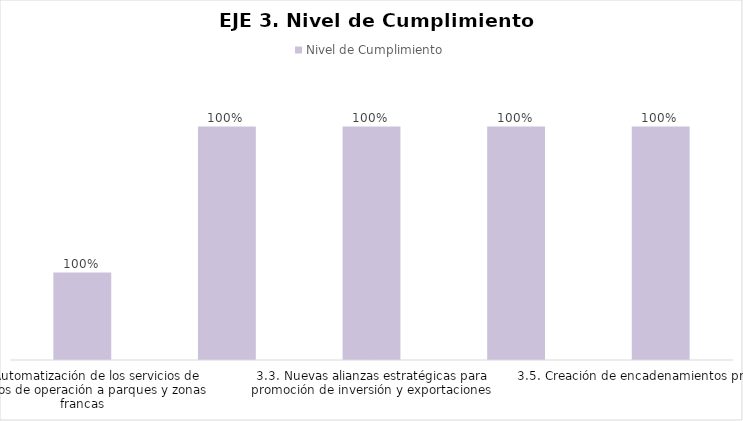
| Category | Nivel de Cumplimiento |
|---|---|
| 3.1. Automatización de los servicios de permisos de operación a parques y zonas francas | 0.995 |
| 3.2.Nuevas instalaciones de zonas francas | 1 |
| 3.3. Nuevas alianzas estratégicas para promoción de inversión y exportaciones | 1 |
| 3.4. Autorización de ampliación en parques de zonas francas | 1 |
| 3.5. Creación de encadenamientos productivos | 1 |